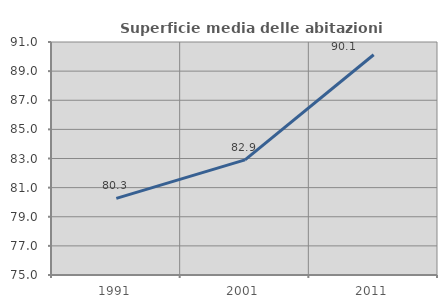
| Category | Superficie media delle abitazioni occupate |
|---|---|
| 1991.0 | 80.258 |
| 2001.0 | 82.906 |
| 2011.0 | 90.124 |